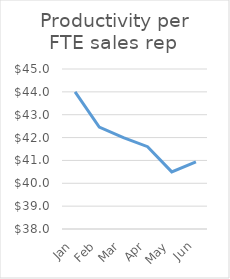
| Category | Productivity per FTE sales rep |
|---|---|
| Jan | 44 |
| Feb | 42.462 |
| Mar | 42 |
| Apr | 41.6 |
| May | 40.5 |
| Jun | 40.941 |